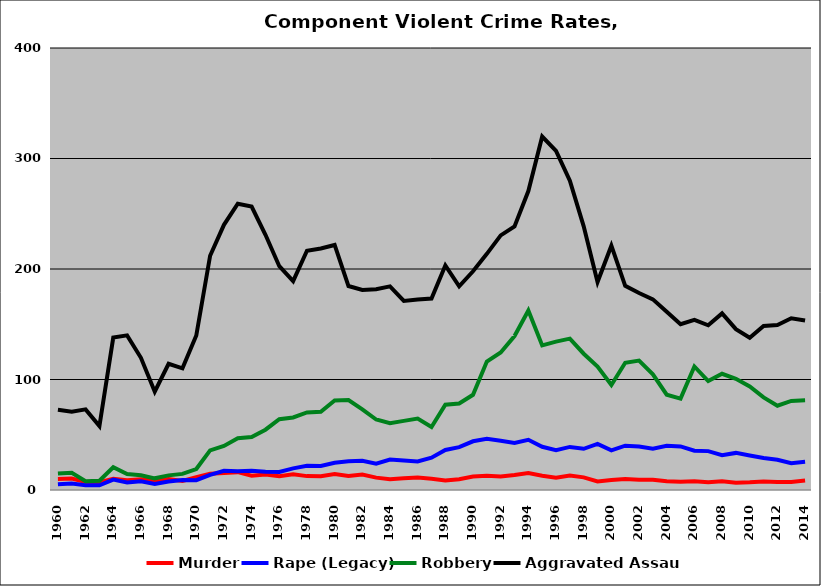
| Category | Murder | Rape (Legacy) | Robbery | Aggravated Assault |
|---|---|---|---|---|
| 1960.0 | 10.009 | 5.142 | 14.875 | 72.631 |
| 1961.0 | 10.339 | 5.824 | 15.576 | 70.926 |
| 1962.0 | 7.295 | 4.27 | 7.963 | 72.954 |
| 1963.0 | 7.162 | 4.279 | 8.341 | 57.904 |
| 1964.0 | 10.069 | 9.378 | 20.57 | 137.943 |
| 1965.0 | 8.919 | 6.894 | 14.39 | 139.94 |
| 1966.0 | 9.669 | 7.95 | 13.322 | 119.639 |
| 1967.0 | 8.688 | 5.537 | 10.562 | 89.012 |
| 1968.0 | 9.906 | 7.643 | 13.237 | 114.261 |
| 1969.0 | 8.125 | 9.099 | 14.6 | 110.114 |
| 1970.0 | 11.502 | 8.931 | 18.99 | 139.834 |
| 1971.0 | 14.735 | 13.702 | 35.894 | 211.995 |
| 1972.0 | 15.378 | 17.455 | 39.859 | 239.991 |
| 1973.0 | 16.133 | 17.054 | 46.822 | 259.053 |
| 1974.0 | 12.866 | 17.427 | 48.021 | 256.54 |
| 1975.0 | 13.939 | 16.454 | 54.561 | 230.946 |
| 1976.0 | 12.489 | 16.313 | 64.104 | 202.506 |
| 1977.0 | 14.316 | 19.59 | 65.676 | 189.075 |
| 1978.0 | 12.562 | 21.839 | 70.216 | 216.556 |
| 1979.0 | 12.552 | 21.737 | 70.74 | 218.579 |
| 1980.0 | 14.533 | 24.647 | 81.028 | 221.741 |
| 1981.0 | 12.609 | 26.008 | 81.383 | 184.585 |
| 1982.0 | 14.034 | 26.46 | 73.03 | 181.066 |
| 1983.0 | 11.21 | 23.811 | 63.78 | 181.639 |
| 1984.0 | 9.7 | 27.521 | 60.508 | 184.257 |
| 1985.0 | 10.563 | 26.713 | 62.572 | 171.068 |
| 1986.0 | 11.238 | 25.829 | 64.648 | 172.419 |
| 1987.0 | 10.248 | 29.219 | 56.99 | 173.295 |
| 1988.0 | 8.565 | 36.201 | 77.198 | 203.274 |
| 1989.0 | 9.653 | 38.802 | 78.329 | 184.395 |
| 1990.0 | 12.164 | 44.069 | 86.157 | 197.962 |
| 1991.0 | 12.809 | 46.258 | 116.319 | 213.696 |
| 1992.0 | 12.242 | 44.606 | 124.484 | 230.413 |
| 1993.0 | 13.507 | 42.565 | 139.349 | 238.441 |
| 1994.0 | 15.324 | 45.41 | 162.458 | 270.513 |
| 1995.0 | 12.903 | 39.08 | 130.886 | 319.911 |
| 1996.0 | 11.082 | 36.119 | 134.242 | 306.811 |
| 1997.0 | 13.109 | 38.997 | 136.983 | 279.897 |
| 1998.0 | 11.446 | 37.282 | 123.328 | 238.626 |
| 1999.0 | 7.693 | 41.754 | 111.644 | 188.217 |
| 2000.0 | 8.964 | 35.822 | 95.02 | 221.116 |
| 2001.0 | 9.861 | 40.109 | 115.186 | 184.738 |
| 2002.0 | 9.209 | 39.313 | 117.067 | 178.287 |
| 2003.0 | 9.262 | 37.432 | 104.628 | 172.553 |
| 2004.0 | 7.826 | 40.024 | 86.287 | 161.233 |
| 2005.0 | 7.358 | 39.436 | 82.689 | 150.078 |
| 2006.0 | 7.971 | 35.56 | 111.801 | 153.992 |
| 2007.0 | 6.989 | 35.186 | 98.637 | 149.069 |
| 2008.0 | 7.959 | 31.528 | 105.162 | 159.818 |
| 2009.0 | 6.572 | 33.571 | 100.576 | 145.563 |
| 2010.0 | 7.01 | 31.241 | 93.654 | 137.802 |
| 2011.0 | 7.792 | 28.984 | 83.83 | 148.382 |
| 2012.0 | 7.132 | 27.424 | 76.244 | 149.341 |
| 2013.0 | 7.252 | 24.263 | 80.643 | 155.37 |
| 2014.0 | 8.617 | 25.517 | 81.16 | 153.369 |